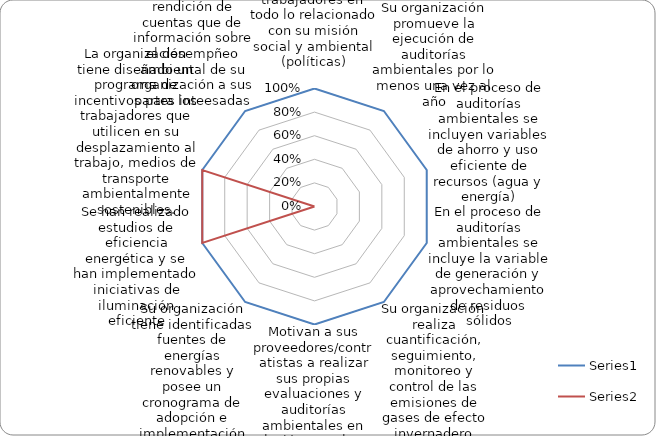
| Category | Series 0 | Series 1 |
|---|---|---|
| Su organización socializa, capacita y forma a sus trabajadores en todo lo relacionado con su misión social y ambiental (políticas) | 1 | 0 |
| Su organización promueve la ejecución de auditorías ambientales por lo menos una vez al año | 1 | 0 |
| En el proceso de auditorías ambientales se incluyen variables de ahorro y uso eficiente de recursos (agua y energía) | 1 | 0 |
| En el proceso de auditorías ambientales se incluye la variable de generación y aprovechamiento de residuos sólidos | 1 | 0 |
| Su organización realiza cuantificación, seguimiento, monitoreo y control de las emisiones de gases de efecto invernadero (inventario GEI, medición de la huella de carbono, programas de mititgación y adaptación al cambio climático, etc.) | 1 | 0 |
| Motivan a sus proveedores/contratistas a realizar sus propias evaluaciones y auditorías ambientales en relación con el uso de electricidad y agua, generación de desechos, emisiones de gases de efecto invernadero y empleo de energías renovables. | 1 | 0 |
| Su organización tiene identificadas fuentes de energías renovables y posee un cronograma de adopción e implementación gradual de estas en su operación  | 1 | 0 |
| Se han realizado estudios de eficiencia energética y se han implementado iniciativas de iluminación eficiente | 1 | 1 |
| La organización tiene diseñado un programa de incentivos para los trabajadores que utilicen en su desplazamiento al trabajo, medios de transporte ambientalmente sostenibles. | 1 | 1 |
| Existe un procedimiento de rendición de cuentas que de información sobre el desempñeo ambiental de su organización a sus partes inteesadas | 1 | 0 |